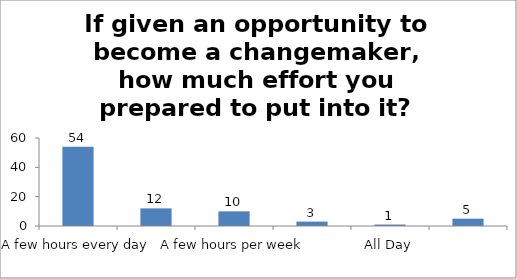
| Category | If given an opportunity to become a changemaker, how much effort you prepared to put into it? |
|---|---|
| A few hours every day | 54 |
| A few hours on alternate days | 12 |
| A few hours per week | 10 |
| A few hours per month | 3 |
| All Day | 1 |
| No Answer | 5 |